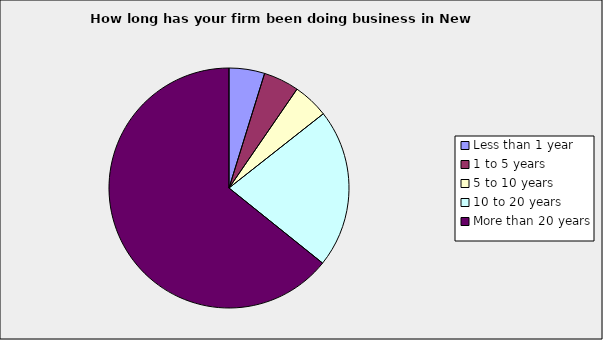
| Category | Series 0 |
|---|---|
| Less than 1 year | 0.048 |
| 1 to 5 years | 0.048 |
| 5 to 10 years | 0.048 |
| 10 to 20 years | 0.214 |
| More than 20 years | 0.643 |